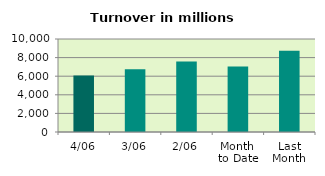
| Category | Series 0 |
|---|---|
| 4/06 | 6066.789 |
| 3/06 | 6744.619 |
| 2/06 | 7583.05 |
| Month 
to Date | 7054.89 |
| Last
Month | 8745.898 |